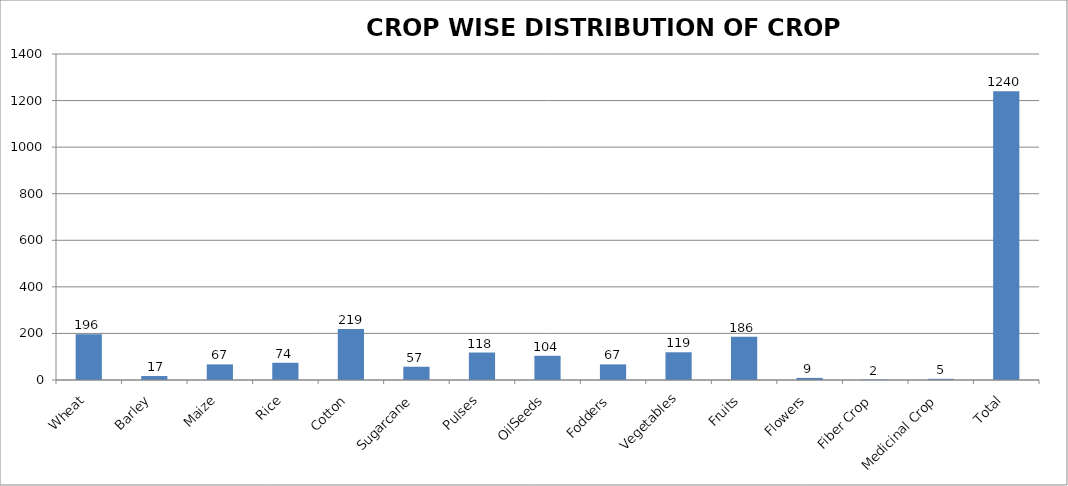
| Category | Series 0 |
|---|---|
| Wheat | 196 |
| Barley | 17 |
| Maize | 67 |
| Rice | 74 |
| Cotton | 219 |
| Sugarcane | 57 |
| Pulses | 118 |
| OilSeeds | 104 |
| Fodders | 67 |
| Vegetables | 119 |
| Fruits | 186 |
| Flowers | 9 |
| Fiber Crop | 2 |
| Medicinal Crop | 5 |
| Total | 1240 |